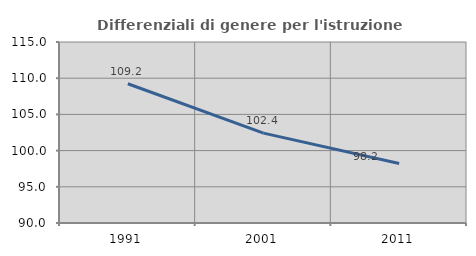
| Category | Differenziali di genere per l'istruzione superiore |
|---|---|
| 1991.0 | 109.238 |
| 2001.0 | 102.414 |
| 2011.0 | 98.209 |